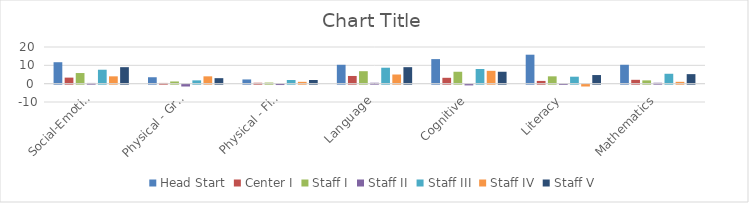
| Category | Head Start | Center I | Staff I | Staff II | Staff III | Staff IV | Staff V |
|---|---|---|---|---|---|---|---|
| Social-Emotional | 11.7 | 3.3 | 5.8 | 0.4 | 7.6 | 4 | 9 |
| Physical - Gross Motor | 3.5 | 0.4 | 1.2 | -1 | 1.8 | 4 | 3 |
| Physical - Fine Motor | 2.3 | 0.5 | 0.6 | -0.2 | 2 | 1 | 2 |
| Language | 10.3 | 4.2 | 6.8 | 0.5 | 8.7 | 5 | 9 |
| Cognitive | 13.4 | 3.2 | 6.5 | -0.4 | 8 | 7 | 6.5 |
| Literacy | 15.8 | 1.5 | 4 | -0.1 | 3.8 | -1 | 4.7 |
| Mathematics | 10.3 | 2.1 | 1.8 | 0.5 | 5.4 | 1 | 5.2 |